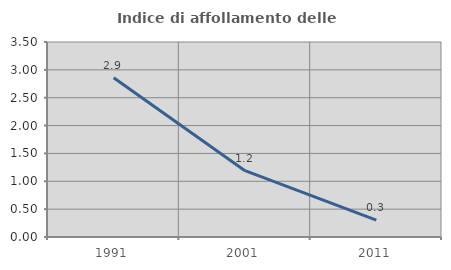
| Category | Indice di affollamento delle abitazioni  |
|---|---|
| 1991.0 | 2.857 |
| 2001.0 | 1.19 |
| 2011.0 | 0.302 |